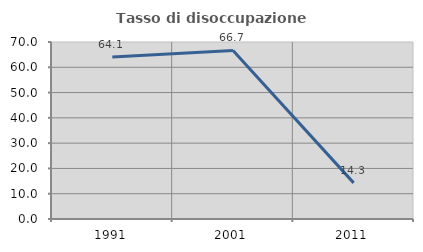
| Category | Tasso di disoccupazione giovanile  |
|---|---|
| 1991.0 | 64.103 |
| 2001.0 | 66.667 |
| 2011.0 | 14.286 |